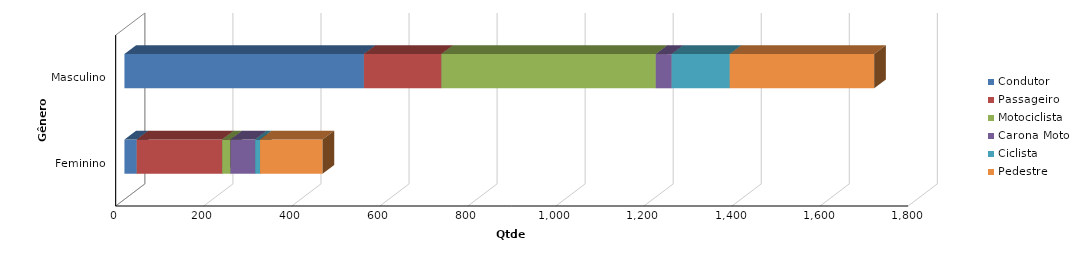
| Category | Condutor | Passageiro | Motociclista | Carona Moto | Ciclista | Pedestre |
|---|---|---|---|---|---|---|
| Feminino | 28 | 194 | 19 | 56 | 11 | 142 |
| Masculino | 544 | 176 | 487 | 36 | 132 | 328 |